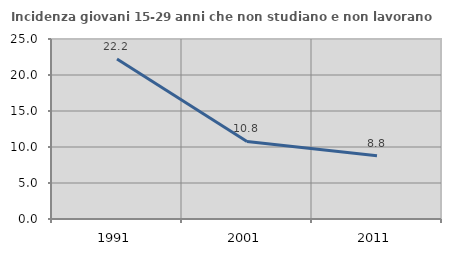
| Category | Incidenza giovani 15-29 anni che non studiano e non lavorano  |
|---|---|
| 1991.0 | 22.222 |
| 2001.0 | 10.769 |
| 2011.0 | 8.772 |